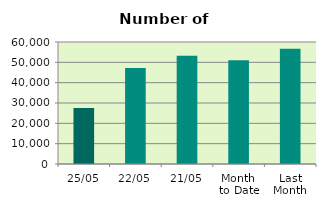
| Category | Series 0 |
|---|---|
| 25/05 | 27540 |
| 22/05 | 47178 |
| 21/05 | 53262 |
| Month 
to Date | 51053.625 |
| Last
Month | 56719.3 |